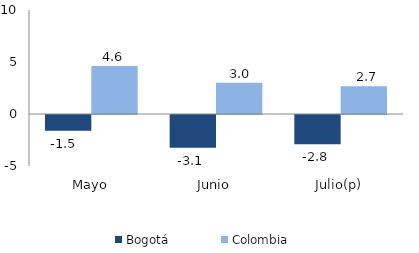
| Category | Bogotá | Colombia |
|---|---|---|
| Mayo | -1.514 | 4.627 |
| Junio | -3.146 | 3.004 |
| Julio(p) | -2.819 | 2.68 |